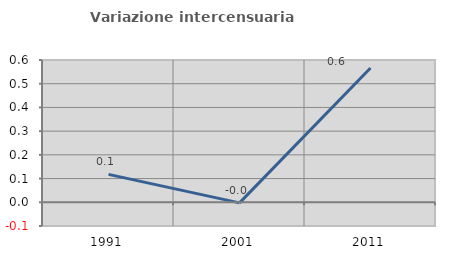
| Category | Variazione intercensuaria annua |
|---|---|
| 1991.0 | 0.118 |
| 2001.0 | -0.002 |
| 2011.0 | 0.566 |